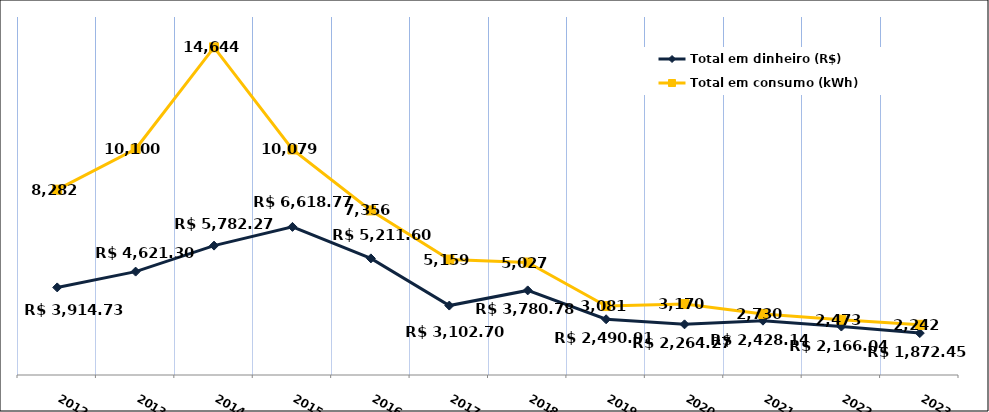
| Category | Total em dinheiro (R$) |
|---|---|
| 2012.0 | 3914.727 |
| 2013.0 | 4621.3 |
| 2014.0 | 5782.27 |
| 2015.0 | 6618.77 |
| 2016.0 | 5211.6 |
| 2017.0 | 3102.7 |
| 2018.0 | 3780.78 |
| 2019.0 | 2490.91 |
| 2020.0 | 2264.27 |
| 2021.0 | 2428.14 |
| 2022.0 | 2166.04 |
| 2023.0 | 1872.45 |